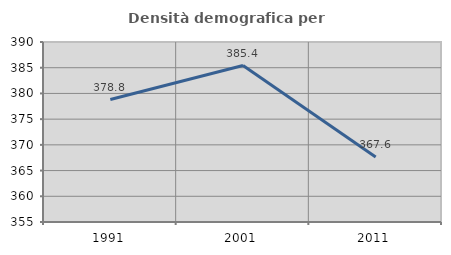
| Category | Densità demografica |
|---|---|
| 1991.0 | 378.817 |
| 2001.0 | 385.427 |
| 2011.0 | 367.63 |